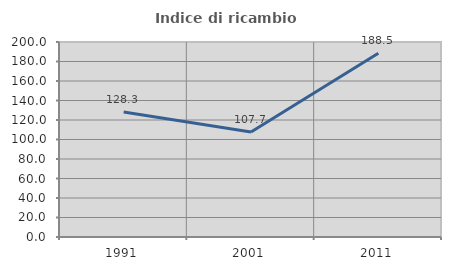
| Category | Indice di ricambio occupazionale  |
|---|---|
| 1991.0 | 128.274 |
| 2001.0 | 107.67 |
| 2011.0 | 188.546 |